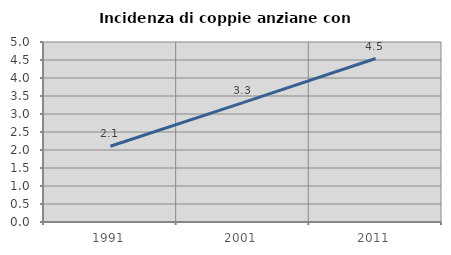
| Category | Incidenza di coppie anziane con figli |
|---|---|
| 1991.0 | 2.105 |
| 2001.0 | 3.318 |
| 2011.0 | 4.54 |